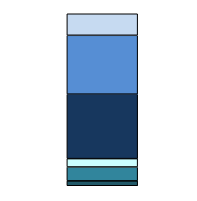
| Category | Series 0 | Series 1 | Series 2 | Series 3 | Series 4 | Series 5 |
|---|---|---|---|---|---|---|
| 0 | 158 | 451 | 270 | 2089 | 1907 | 698 |